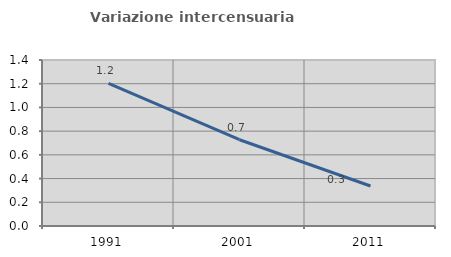
| Category | Variazione intercensuaria annua |
|---|---|
| 1991.0 | 1.204 |
| 2001.0 | 0.728 |
| 2011.0 | 0.337 |